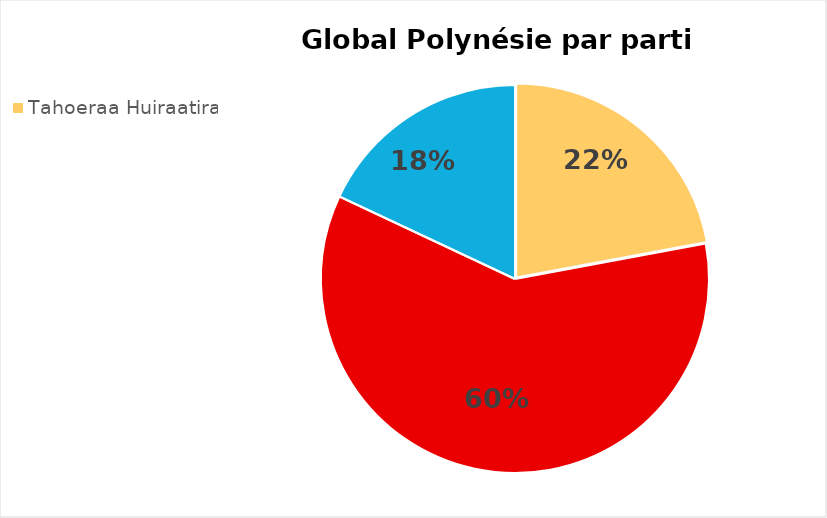
| Category | Global Polynésie |
|---|---|
| Tahoeraa Huiraatira | 20351 |
| Tapura Huiraatira | 55229 |
| Tavini Huiraatira | 16603 |